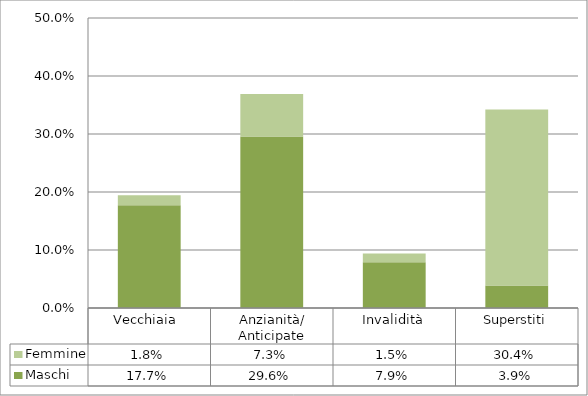
| Category | Maschi | Femmine |
|---|---|---|
| Vecchiaia  | 0.177 | 0.018 |
| Anzianità/ Anticipate | 0.296 | 0.073 |
| Invalidità | 0.079 | 0.015 |
| Superstiti | 0.039 | 0.304 |